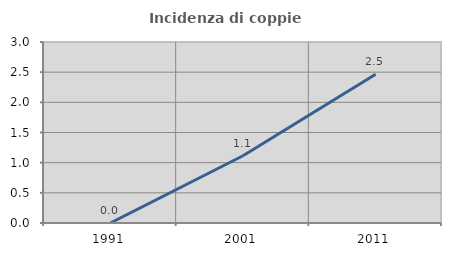
| Category | Incidenza di coppie miste |
|---|---|
| 1991.0 | 0 |
| 2001.0 | 1.115 |
| 2011.0 | 2.465 |